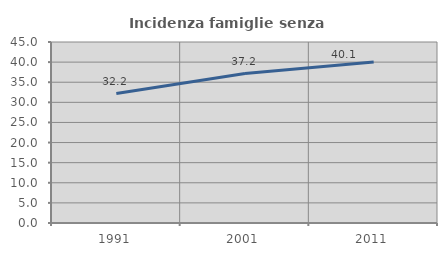
| Category | Incidenza famiglie senza nuclei |
|---|---|
| 1991.0 | 32.177 |
| 2001.0 | 37.156 |
| 2011.0 | 40.052 |